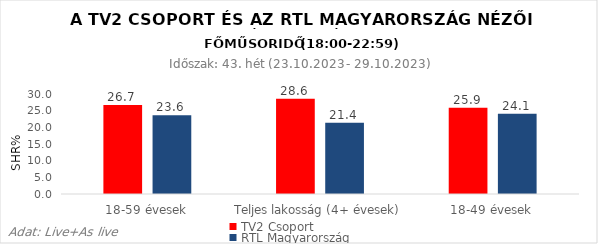
| Category | TV2 Csoport | RTL Magyarország |
|---|---|---|
| 18-59 évesek | 26.7 | 23.6 |
| Teljes lakosság (4+ évesek) | 28.6 | 21.4 |
| 18-49 évesek | 25.9 | 24.1 |